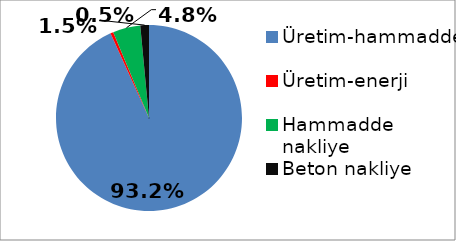
| Category | Series 0 |
|---|---|
| Üretim-hammadde | 288.463 |
| Üretim-enerji | 1.6 |
| Hammadde nakliye | 14.796 |
| Beton nakliye | 4.65 |